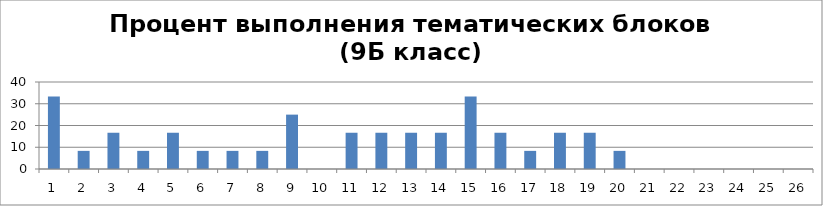
| Category | Series 0 |
|---|---|
| 0 | 33.333 |
| 1 | 8.333 |
| 2 | 16.667 |
| 3 | 8.333 |
| 4 | 16.667 |
| 5 | 8.333 |
| 6 | 8.333 |
| 7 | 8.333 |
| 8 | 25 |
| 9 | 0 |
| 10 | 16.667 |
| 11 | 16.667 |
| 12 | 16.667 |
| 13 | 16.667 |
| 14 | 33.333 |
| 15 | 16.667 |
| 16 | 8.333 |
| 17 | 16.667 |
| 18 | 16.667 |
| 19 | 8.333 |
| 20 | 0 |
| 21 | 0 |
| 22 | 0 |
| 23 | 0 |
| 24 | 0 |
| 25 | 0 |